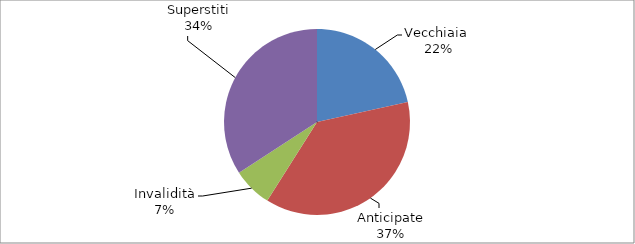
| Category | Series 0 |
|---|---|
| Vecchiaia  | 51415 |
| Anticipate | 89278 |
| Invalidità | 16381 |
| Superstiti | 81507 |